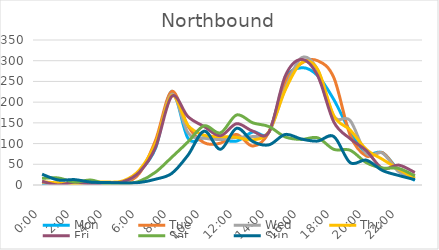
| Category | Mon | Tue | Wed | Thu | Fri | Sat | Sun |
|---|---|---|---|---|---|---|---|
| 0.0 | 3 | 6 | 7 | 8 | 9 | 16 | 26 |
| 0.041667 | 1 | 4 | 2 | 5 | 0 | 17 | 12 |
| 0.083333 | 3 | 2 | 5 | 3 | 7 | 7 | 13 |
| 0.125 | 4 | 6 | 5 | 8 | 3 | 12 | 7 |
| 0.166667 | 2 | 3 | 2 | 7 | 5 | 2 | 6 |
| 0.208333 | 5 | 5 | 6 | 10 | 8 | 2 | 5 |
| 0.25 | 33 | 28 | 32 | 36 | 31 | 9 | 6 |
| 0.291667 | 89 | 108 | 97 | 101 | 91 | 31 | 14 |
| 0.333333 | 226 | 226 | 219 | 216 | 214 | 67 | 28 |
| 0.375 | 113 | 142 | 126 | 144 | 165 | 104 | 72 |
| 0.416667 | 114 | 102 | 113 | 120 | 141 | 143 | 130 |
| 0.458333 | 110 | 101 | 110 | 117 | 119 | 126 | 86 |
| 0.5 | 106 | 122 | 115 | 115 | 148 | 169 | 137 |
| 0.541667 | 128 | 94 | 117 | 109 | 130 | 150 | 105 |
| 0.5833333333333334 | 128 | 128 | 128 | 129 | 128 | 141 | 97 |
| 0.625 | 255 | 248 | 233 | 229 | 263 | 116 | 122 |
| 0.666667 | 283 | 294 | 307 | 295 | 303 | 110 | 111 |
| 0.708333 | 264 | 300 | 278 | 279 | 264 | 114 | 106 |
| 0.75 | 206 | 259 | 166 | 167 | 152 | 86 | 117 |
| 0.791667 | 130 | 121 | 156 | 133 | 112 | 84 | 54 |
| 0.833333 | 77 | 70 | 76 | 86 | 83 | 54 | 60 |
| 0.875 | 78 | 78 | 77 | 62 | 40 | 41 | 35 |
| 0.916667 | 36 | 35 | 32 | 38 | 48 | 40 | 23 |
| 0.958333 | 11 | 23 | 19 | 16 | 30 | 22 | 13 |